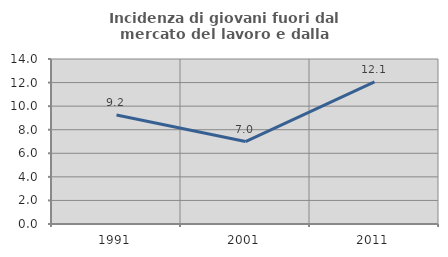
| Category | Incidenza di giovani fuori dal mercato del lavoro e dalla formazione  |
|---|---|
| 1991.0 | 9.249 |
| 2001.0 | 6.993 |
| 2011.0 | 12.06 |